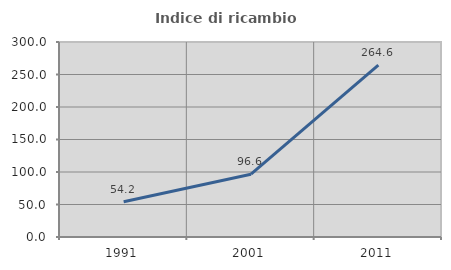
| Category | Indice di ricambio occupazionale  |
|---|---|
| 1991.0 | 54.245 |
| 2001.0 | 96.644 |
| 2011.0 | 264.583 |